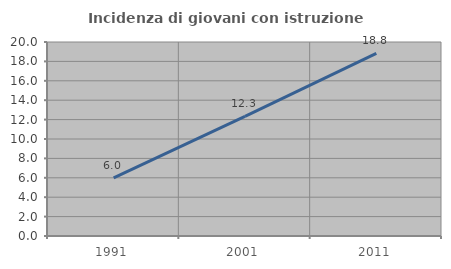
| Category | Incidenza di giovani con istruzione universitaria |
|---|---|
| 1991.0 | 5.997 |
| 2001.0 | 12.34 |
| 2011.0 | 18.819 |